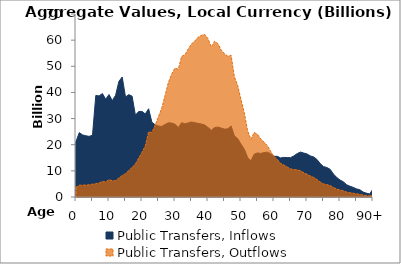
| Category | Public Transfers, Inflows | Public Transfers, Outflows |
|---|---|---|
| 0 | 21235.459 | 3676.231 |
|  | 24634.373 | 4527.763 |
| 2 | 23746.597 | 4528.977 |
| 3 | 23418.932 | 4578.023 |
| 4 | 23185.899 | 4666.848 |
| 5 | 23672.509 | 4912.959 |
| 6 | 38833.852 | 5088.5 |
| 7 | 38658.341 | 5360.565 |
| 8 | 39588.1 | 5945.546 |
| 9 | 37413.173 | 5773.981 |
| 10 | 39191.965 | 6621.563 |
| 11 | 36881.155 | 6227.487 |
| 12 | 38923.753 | 6254.775 |
| 13 | 44217.719 | 7298.182 |
| 14 | 45911.185 | 8212.434 |
| 15 | 38243.225 | 8951.944 |
| 16 | 39162.602 | 10154.046 |
| 17 | 38552.398 | 11347.769 |
| 18 | 31316.897 | 12589.208 |
| 19 | 32719.113 | 14899.16 |
| 20 | 32721.571 | 17120.088 |
| 21 | 31770.097 | 19485.385 |
| 22 | 33754.471 | 24946.35 |
| 23 | 28597.866 | 24682.637 |
| 24 | 27584.325 | 27533.04 |
| 25 | 27137.218 | 30787.32 |
| 26 | 26991.576 | 34036.709 |
| 27 | 27773.467 | 38904.489 |
| 28 | 28385.322 | 43800.947 |
| 29 | 28287.169 | 47012.07 |
| 30 | 27854.732 | 49293.026 |
| 31 | 26555.577 | 48871.926 |
| 32 | 28422.963 | 53773.152 |
| 33 | 27986.48 | 54397.895 |
| 34 | 28330.268 | 56587.997 |
| 35 | 28682.106 | 58545.43 |
| 36 | 28424.864 | 59679.138 |
| 37 | 28168.469 | 61120.05 |
| 38 | 27911.464 | 61840.459 |
| 39 | 27570.097 | 62212.508 |
| 40 | 26600.086 | 60580.408 |
| 41 | 25500.511 | 57370.6 |
| 42 | 26593.721 | 59555.247 |
| 43 | 26755.349 | 58682.62 |
| 44 | 26349.001 | 56170.116 |
| 45 | 25969.626 | 54840.585 |
| 46 | 26078.057 | 53843.228 |
| 47 | 27178.086 | 54201.109 |
| 48 | 23374.023 | 45961.14 |
| 49 | 22335.727 | 42620.307 |
| 50 | 20233.212 | 37249.555 |
| 51 | 18278.991 | 32224.222 |
| 52 | 15160.488 | 25362.393 |
| 53 | 13818.524 | 22035.284 |
| 54 | 16365.253 | 24690.539 |
| 55 | 16862.773 | 23951.524 |
| 56 | 16669.132 | 22167.116 |
| 57 | 17001.783 | 21013.034 |
| 58 | 17163.872 | 19590.732 |
| 59 | 16497.417 | 17487.775 |
| 60 | 15563.072 | 15455.308 |
| 61 | 15563.456 | 14370.124 |
| 62 | 14939.595 | 12834.007 |
| 63 | 15153.36 | 12224.94 |
| 64 | 15073.698 | 11492.867 |
| 65 | 15050.385 | 10790.503 |
| 66 | 15702.573 | 10478.197 |
| 67 | 16581.7 | 10400.429 |
| 68 | 17184.839 | 10053.359 |
| 69 | 16828.442 | 9318.171 |
| 70 | 16456.488 | 8700.045 |
| 71 | 15730.636 | 8026.346 |
| 72 | 15314.326 | 7511.117 |
| 73 | 14392.857 | 6731.888 |
| 74 | 12804.486 | 5742.829 |
| 75 | 11638.658 | 5020.344 |
| 76 | 11289.28 | 4746.802 |
| 77 | 10603.274 | 4380.567 |
| 78 | 8808.202 | 3622.048 |
| 79 | 7482.346 | 3078.421 |
| 80 | 6499.423 | 2686.771 |
| 81 | 5825.725 | 2377.92 |
| 82 | 4693.548 | 1886.956 |
| 83 | 4126.248 | 1639.492 |
| 84 | 3690.076 | 1453.098 |
| 85 | 3100.198 | 1203.599 |
| 86 | 2788.86 | 1065.728 |
| 87 | 1891.913 | 710.315 |
| 88 | 1478.912 | 544.625 |
| 89 | 1138.027 | 409.542 |
| 90+ | 3087.313 | 1078.434 |